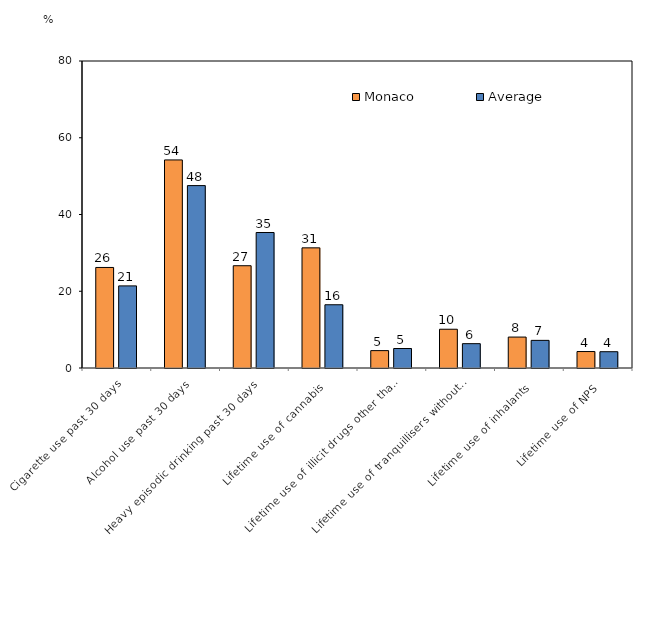
| Category | Monaco | Average |
|---|---|---|
| Cigarette use past 30 days | 26.2 | 21.397 |
| Alcohol use past 30 days | 54.22 | 47.531 |
| Heavy episodic drinking past 30 days | 26.65 | 35.309 |
| Lifetime use of cannabis | 31.31 | 16.48 |
| Lifetime use of illicit drugs other than cannabis | 4.53 | 5.079 |
| Lifetime use of tranquillisers without prescription  | 10.1 | 6.34 |
| Lifetime use of inhalants | 8.06 | 7.202 |
| Lifetime use of NPS | 4.29 | 4.246 |